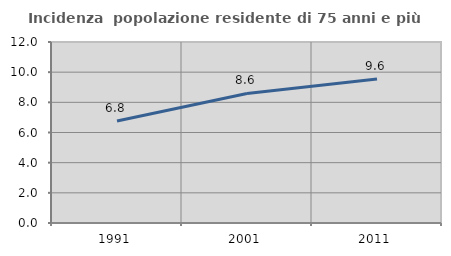
| Category | Incidenza  popolazione residente di 75 anni e più |
|---|---|
| 1991.0 | 6.758 |
| 2001.0 | 8.587 |
| 2011.0 | 9.551 |